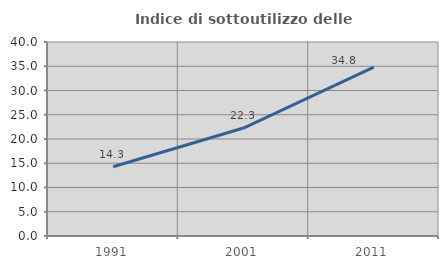
| Category | Indice di sottoutilizzo delle abitazioni  |
|---|---|
| 1991.0 | 14.286 |
| 2001.0 | 22.26 |
| 2011.0 | 34.803 |